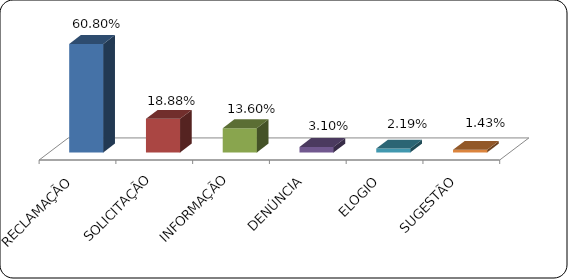
| Category | Series 0 |
|---|---|
|      RECLAMAÇÃO | 0.608 |
|      SOLICITAÇÃO | 0.189 |
|      INFORMAÇÃO | 0.136 |
|      DENÚNCIA | 0.031 |
|      ELOGIO | 0.022 |
|      SUGESTÃO | 0.014 |